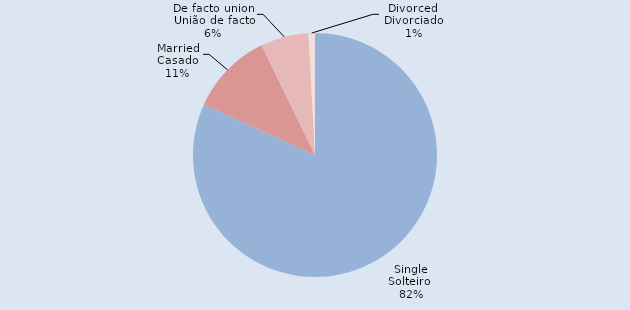
| Category | Series 1 |
|---|---|
| Single
Solteiro  | 283 |
| Married
Casado | 38 |
| De facto union
União de facto | 22 |
| Divorced
Divorciado | 3 |